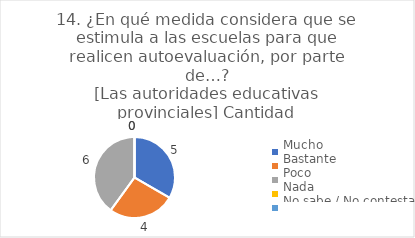
| Category | 14. ¿En qué medida considera que se estimula a las escuelas para que realicen autoevaluación, por parte de…?
[Las autoridades educativas provinciales] |
|---|---|
| Mucho  | 0.333 |
| Bastante  | 0.267 |
| Poco  | 0.4 |
| Nada  | 0 |
| No sabe / No contesta | 0 |